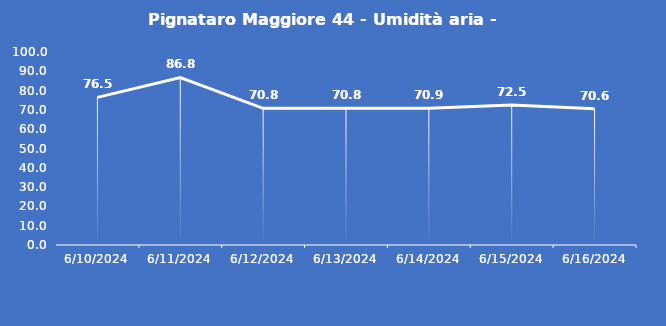
| Category | Pignataro Maggiore 44 - Umidità aria - Grezzo (%) |
|---|---|
| 6/10/24 | 76.5 |
| 6/11/24 | 86.8 |
| 6/12/24 | 70.8 |
| 6/13/24 | 70.8 |
| 6/14/24 | 70.9 |
| 6/15/24 | 72.5 |
| 6/16/24 | 70.6 |